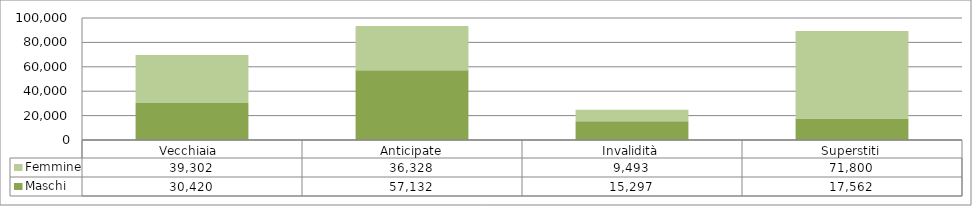
| Category | Maschi | Femmine |
|---|---|---|
| Vecchiaia  | 30420 | 39302 |
| Anticipate | 57132 | 36328 |
| Invalidità | 15297 | 9493 |
| Superstiti | 17562 | 71800 |